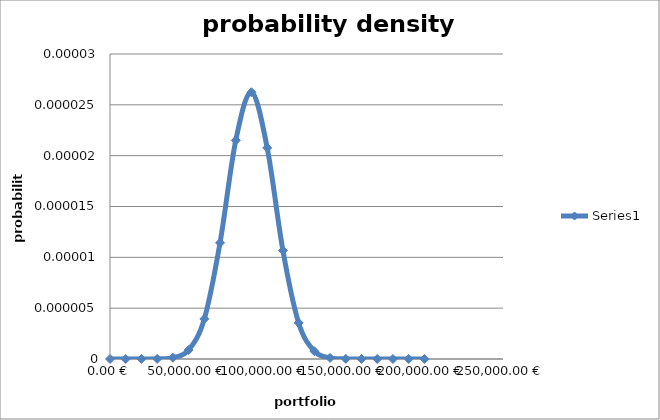
| Category | Series 0 |
|---|---|
| 0.0 | 0 |
| 10000.0 | 0 |
| 20000.0 | 0 |
| 30000.0 | 0 |
| 40000.0 | 0 |
| 50000.0 | 0 |
| 60000.0 | 0 |
| 70000.0 | 0 |
| 80000.0 | 0 |
| 90000.0 | 0 |
| 100000.0 | 0 |
| 110000.0 | 0 |
| 120000.0 | 0 |
| 130000.0 | 0 |
| 140000.0 | 0 |
| 150000.0 | 0 |
| 160000.0 | 0 |
| 170000.0 | 0 |
| 180000.0 | 0 |
| 190000.0 | 0 |
| 200000.0 | 0 |